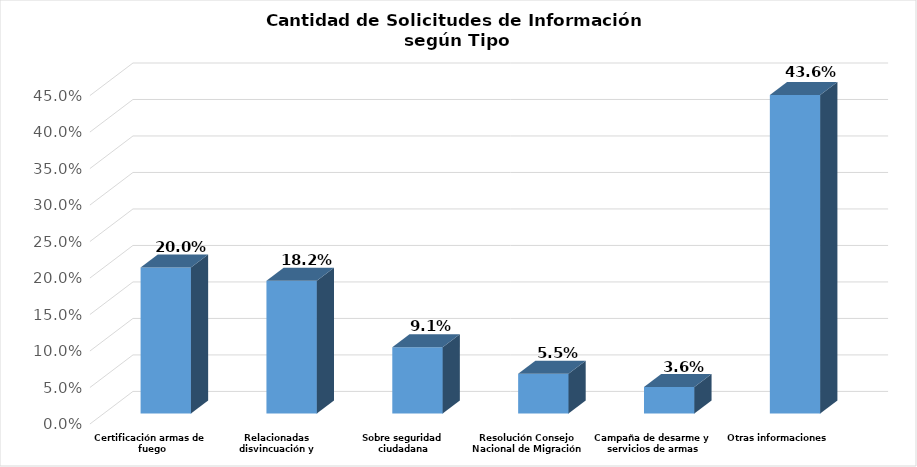
| Category | Series 0 |
|---|---|
| Certificación armas de fuego | 0.2 |
| Relacionadas disvincuación y prestaciones laborales | 0.182 |
| Sobre seguridad ciudadana | 0.091 |
| Resolución Consejo Nacional de Migración | 0.055 |
| Campaña de desarme y servicios de armas | 0.036 |
| Otras informaciones | 0.436 |